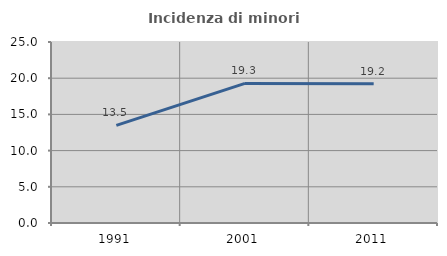
| Category | Incidenza di minori stranieri |
|---|---|
| 1991.0 | 13.483 |
| 2001.0 | 19.275 |
| 2011.0 | 19.244 |